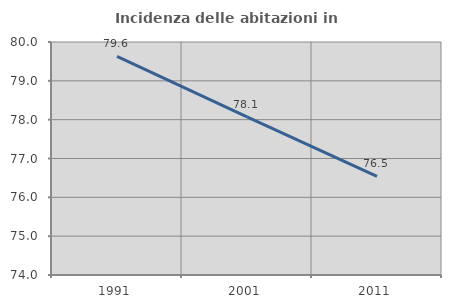
| Category | Incidenza delle abitazioni in proprietà  |
|---|---|
| 1991.0 | 79.627 |
| 2001.0 | 78.072 |
| 2011.0 | 76.542 |